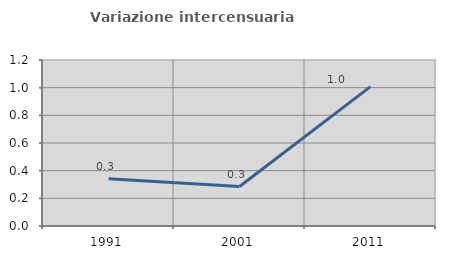
| Category | Variazione intercensuaria annua |
|---|---|
| 1991.0 | 0.342 |
| 2001.0 | 0.285 |
| 2011.0 | 1.007 |